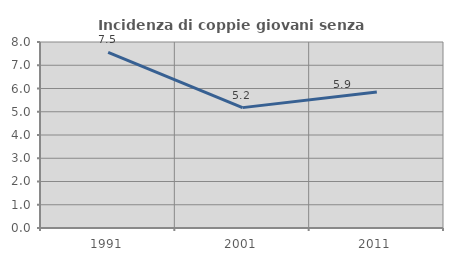
| Category | Incidenza di coppie giovani senza figli |
|---|---|
| 1991.0 | 7.549 |
| 2001.0 | 5.178 |
| 2011.0 | 5.854 |